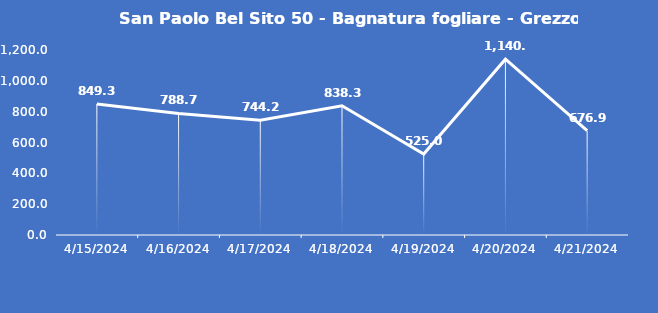
| Category | San Paolo Bel Sito 50 - Bagnatura fogliare - Grezzo (min) |
|---|---|
| 4/15/24 | 849.3 |
| 4/16/24 | 788.7 |
| 4/17/24 | 744.2 |
| 4/18/24 | 838.3 |
| 4/19/24 | 525 |
| 4/20/24 | 1140.6 |
| 4/21/24 | 676.9 |